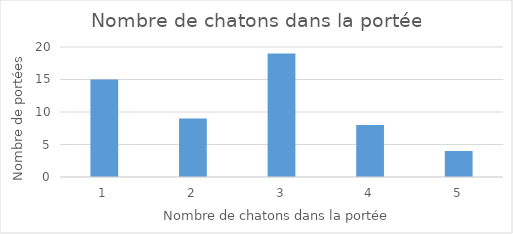
| Category | Series 0 |
|---|---|
| 1.0 | 15 |
| 2.0 | 9 |
| 3.0 | 19 |
| 4.0 | 8 |
| 5.0 | 4 |